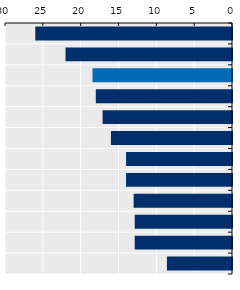
| Category | Length in weeks |
|---|---|
| Viet Nam* | 26 |
| New Zealand | 22 |
| OECD average | 18.436 |
| Australia | 18 |
| Mongolia* | 17.1 |
| Singapore* | 16 |
| China | 14 |
| Japan | 14 |
| Indonesia* | 13 |
| Korea | 12.857 |
| Thailand* | 12.857 |
| Malaysia* | 8.6 |